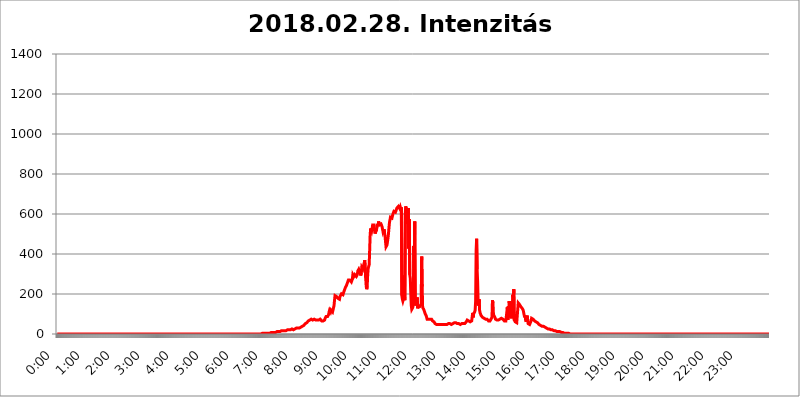
| Category | 2018.02.28. Intenzitás [W/m^2] |
|---|---|
| 0.0 | 0 |
| 0.0006944444444444445 | 0 |
| 0.001388888888888889 | 0 |
| 0.0020833333333333333 | 0 |
| 0.002777777777777778 | 0 |
| 0.003472222222222222 | 0 |
| 0.004166666666666667 | 0 |
| 0.004861111111111111 | 0 |
| 0.005555555555555556 | 0 |
| 0.0062499999999999995 | 0 |
| 0.006944444444444444 | 0 |
| 0.007638888888888889 | 0 |
| 0.008333333333333333 | 0 |
| 0.009027777777777779 | 0 |
| 0.009722222222222222 | 0 |
| 0.010416666666666666 | 0 |
| 0.011111111111111112 | 0 |
| 0.011805555555555555 | 0 |
| 0.012499999999999999 | 0 |
| 0.013194444444444444 | 0 |
| 0.013888888888888888 | 0 |
| 0.014583333333333332 | 0 |
| 0.015277777777777777 | 0 |
| 0.015972222222222224 | 0 |
| 0.016666666666666666 | 0 |
| 0.017361111111111112 | 0 |
| 0.018055555555555557 | 0 |
| 0.01875 | 0 |
| 0.019444444444444445 | 0 |
| 0.02013888888888889 | 0 |
| 0.020833333333333332 | 0 |
| 0.02152777777777778 | 0 |
| 0.022222222222222223 | 0 |
| 0.02291666666666667 | 0 |
| 0.02361111111111111 | 0 |
| 0.024305555555555556 | 0 |
| 0.024999999999999998 | 0 |
| 0.025694444444444447 | 0 |
| 0.02638888888888889 | 0 |
| 0.027083333333333334 | 0 |
| 0.027777777777777776 | 0 |
| 0.02847222222222222 | 0 |
| 0.029166666666666664 | 0 |
| 0.029861111111111113 | 0 |
| 0.030555555555555555 | 0 |
| 0.03125 | 0 |
| 0.03194444444444445 | 0 |
| 0.03263888888888889 | 0 |
| 0.03333333333333333 | 0 |
| 0.034027777777777775 | 0 |
| 0.034722222222222224 | 0 |
| 0.035416666666666666 | 0 |
| 0.036111111111111115 | 0 |
| 0.03680555555555556 | 0 |
| 0.0375 | 0 |
| 0.03819444444444444 | 0 |
| 0.03888888888888889 | 0 |
| 0.03958333333333333 | 0 |
| 0.04027777777777778 | 0 |
| 0.04097222222222222 | 0 |
| 0.041666666666666664 | 0 |
| 0.042361111111111106 | 0 |
| 0.04305555555555556 | 0 |
| 0.043750000000000004 | 0 |
| 0.044444444444444446 | 0 |
| 0.04513888888888889 | 0 |
| 0.04583333333333334 | 0 |
| 0.04652777777777778 | 0 |
| 0.04722222222222222 | 0 |
| 0.04791666666666666 | 0 |
| 0.04861111111111111 | 0 |
| 0.049305555555555554 | 0 |
| 0.049999999999999996 | 0 |
| 0.05069444444444445 | 0 |
| 0.051388888888888894 | 0 |
| 0.052083333333333336 | 0 |
| 0.05277777777777778 | 0 |
| 0.05347222222222222 | 0 |
| 0.05416666666666667 | 0 |
| 0.05486111111111111 | 0 |
| 0.05555555555555555 | 0 |
| 0.05625 | 0 |
| 0.05694444444444444 | 0 |
| 0.057638888888888885 | 0 |
| 0.05833333333333333 | 0 |
| 0.05902777777777778 | 0 |
| 0.059722222222222225 | 0 |
| 0.06041666666666667 | 0 |
| 0.061111111111111116 | 0 |
| 0.06180555555555556 | 0 |
| 0.0625 | 0 |
| 0.06319444444444444 | 0 |
| 0.06388888888888888 | 0 |
| 0.06458333333333334 | 0 |
| 0.06527777777777778 | 0 |
| 0.06597222222222222 | 0 |
| 0.06666666666666667 | 0 |
| 0.06736111111111111 | 0 |
| 0.06805555555555555 | 0 |
| 0.06874999999999999 | 0 |
| 0.06944444444444443 | 0 |
| 0.07013888888888889 | 0 |
| 0.07083333333333333 | 0 |
| 0.07152777777777779 | 0 |
| 0.07222222222222223 | 0 |
| 0.07291666666666667 | 0 |
| 0.07361111111111111 | 0 |
| 0.07430555555555556 | 0 |
| 0.075 | 0 |
| 0.07569444444444444 | 0 |
| 0.0763888888888889 | 0 |
| 0.07708333333333334 | 0 |
| 0.07777777777777778 | 0 |
| 0.07847222222222222 | 0 |
| 0.07916666666666666 | 0 |
| 0.0798611111111111 | 0 |
| 0.08055555555555556 | 0 |
| 0.08125 | 0 |
| 0.08194444444444444 | 0 |
| 0.08263888888888889 | 0 |
| 0.08333333333333333 | 0 |
| 0.08402777777777777 | 0 |
| 0.08472222222222221 | 0 |
| 0.08541666666666665 | 0 |
| 0.08611111111111112 | 0 |
| 0.08680555555555557 | 0 |
| 0.08750000000000001 | 0 |
| 0.08819444444444445 | 0 |
| 0.08888888888888889 | 0 |
| 0.08958333333333333 | 0 |
| 0.09027777777777778 | 0 |
| 0.09097222222222222 | 0 |
| 0.09166666666666667 | 0 |
| 0.09236111111111112 | 0 |
| 0.09305555555555556 | 0 |
| 0.09375 | 0 |
| 0.09444444444444444 | 0 |
| 0.09513888888888888 | 0 |
| 0.09583333333333333 | 0 |
| 0.09652777777777777 | 0 |
| 0.09722222222222222 | 0 |
| 0.09791666666666667 | 0 |
| 0.09861111111111111 | 0 |
| 0.09930555555555555 | 0 |
| 0.09999999999999999 | 0 |
| 0.10069444444444443 | 0 |
| 0.1013888888888889 | 0 |
| 0.10208333333333335 | 0 |
| 0.10277777777777779 | 0 |
| 0.10347222222222223 | 0 |
| 0.10416666666666667 | 0 |
| 0.10486111111111111 | 0 |
| 0.10555555555555556 | 0 |
| 0.10625 | 0 |
| 0.10694444444444444 | 0 |
| 0.1076388888888889 | 0 |
| 0.10833333333333334 | 0 |
| 0.10902777777777778 | 0 |
| 0.10972222222222222 | 0 |
| 0.1111111111111111 | 0 |
| 0.11180555555555556 | 0 |
| 0.11180555555555556 | 0 |
| 0.1125 | 0 |
| 0.11319444444444444 | 0 |
| 0.11388888888888889 | 0 |
| 0.11458333333333333 | 0 |
| 0.11527777777777777 | 0 |
| 0.11597222222222221 | 0 |
| 0.11666666666666665 | 0 |
| 0.1173611111111111 | 0 |
| 0.11805555555555557 | 0 |
| 0.11944444444444445 | 0 |
| 0.12013888888888889 | 0 |
| 0.12083333333333333 | 0 |
| 0.12152777777777778 | 0 |
| 0.12222222222222223 | 0 |
| 0.12291666666666667 | 0 |
| 0.12291666666666667 | 0 |
| 0.12361111111111112 | 0 |
| 0.12430555555555556 | 0 |
| 0.125 | 0 |
| 0.12569444444444444 | 0 |
| 0.12638888888888888 | 0 |
| 0.12708333333333333 | 0 |
| 0.16875 | 0 |
| 0.12847222222222224 | 0 |
| 0.12916666666666668 | 0 |
| 0.12986111111111112 | 0 |
| 0.13055555555555556 | 0 |
| 0.13125 | 0 |
| 0.13194444444444445 | 0 |
| 0.1326388888888889 | 0 |
| 0.13333333333333333 | 0 |
| 0.13402777777777777 | 0 |
| 0.13402777777777777 | 0 |
| 0.13472222222222222 | 0 |
| 0.13541666666666666 | 0 |
| 0.1361111111111111 | 0 |
| 0.13749999999999998 | 0 |
| 0.13819444444444443 | 0 |
| 0.1388888888888889 | 0 |
| 0.13958333333333334 | 0 |
| 0.14027777777777778 | 0 |
| 0.14097222222222222 | 0 |
| 0.14166666666666666 | 0 |
| 0.1423611111111111 | 0 |
| 0.14305555555555557 | 0 |
| 0.14375000000000002 | 0 |
| 0.14444444444444446 | 0 |
| 0.1451388888888889 | 0 |
| 0.1451388888888889 | 0 |
| 0.14652777777777778 | 0 |
| 0.14722222222222223 | 0 |
| 0.14791666666666667 | 0 |
| 0.1486111111111111 | 0 |
| 0.14930555555555555 | 0 |
| 0.15 | 0 |
| 0.15069444444444444 | 0 |
| 0.15138888888888888 | 0 |
| 0.15208333333333332 | 0 |
| 0.15277777777777776 | 0 |
| 0.15347222222222223 | 0 |
| 0.15416666666666667 | 0 |
| 0.15486111111111112 | 0 |
| 0.15555555555555556 | 0 |
| 0.15625 | 0 |
| 0.15694444444444444 | 0 |
| 0.15763888888888888 | 0 |
| 0.15833333333333333 | 0 |
| 0.15902777777777777 | 0 |
| 0.15972222222222224 | 0 |
| 0.16041666666666668 | 0 |
| 0.16111111111111112 | 0 |
| 0.16180555555555556 | 0 |
| 0.1625 | 0 |
| 0.16319444444444445 | 0 |
| 0.1638888888888889 | 0 |
| 0.16458333333333333 | 0 |
| 0.16527777777777777 | 0 |
| 0.16597222222222222 | 0 |
| 0.16666666666666666 | 0 |
| 0.1673611111111111 | 0 |
| 0.16805555555555554 | 0 |
| 0.16874999999999998 | 0 |
| 0.16944444444444443 | 0 |
| 0.17013888888888887 | 0 |
| 0.1708333333333333 | 0 |
| 0.17152777777777775 | 0 |
| 0.17222222222222225 | 0 |
| 0.1729166666666667 | 0 |
| 0.17361111111111113 | 0 |
| 0.17430555555555557 | 0 |
| 0.17500000000000002 | 0 |
| 0.17569444444444446 | 0 |
| 0.1763888888888889 | 0 |
| 0.17708333333333334 | 0 |
| 0.17777777777777778 | 0 |
| 0.17847222222222223 | 0 |
| 0.17916666666666667 | 0 |
| 0.1798611111111111 | 0 |
| 0.18055555555555555 | 0 |
| 0.18125 | 0 |
| 0.18194444444444444 | 0 |
| 0.1826388888888889 | 0 |
| 0.18333333333333335 | 0 |
| 0.1840277777777778 | 0 |
| 0.18472222222222223 | 0 |
| 0.18541666666666667 | 0 |
| 0.18611111111111112 | 0 |
| 0.18680555555555556 | 0 |
| 0.1875 | 0 |
| 0.18819444444444444 | 0 |
| 0.18888888888888888 | 0 |
| 0.18958333333333333 | 0 |
| 0.19027777777777777 | 0 |
| 0.1909722222222222 | 0 |
| 0.19166666666666665 | 0 |
| 0.19236111111111112 | 0 |
| 0.19305555555555554 | 0 |
| 0.19375 | 0 |
| 0.19444444444444445 | 0 |
| 0.1951388888888889 | 0 |
| 0.19583333333333333 | 0 |
| 0.19652777777777777 | 0 |
| 0.19722222222222222 | 0 |
| 0.19791666666666666 | 0 |
| 0.1986111111111111 | 0 |
| 0.19930555555555554 | 0 |
| 0.19999999999999998 | 0 |
| 0.20069444444444443 | 0 |
| 0.20138888888888887 | 0 |
| 0.2020833333333333 | 0 |
| 0.2027777777777778 | 0 |
| 0.2034722222222222 | 0 |
| 0.2041666666666667 | 0 |
| 0.20486111111111113 | 0 |
| 0.20555555555555557 | 0 |
| 0.20625000000000002 | 0 |
| 0.20694444444444446 | 0 |
| 0.2076388888888889 | 0 |
| 0.20833333333333334 | 0 |
| 0.20902777777777778 | 0 |
| 0.20972222222222223 | 0 |
| 0.21041666666666667 | 0 |
| 0.2111111111111111 | 0 |
| 0.21180555555555555 | 0 |
| 0.2125 | 0 |
| 0.21319444444444444 | 0 |
| 0.2138888888888889 | 0 |
| 0.21458333333333335 | 0 |
| 0.2152777777777778 | 0 |
| 0.21597222222222223 | 0 |
| 0.21666666666666667 | 0 |
| 0.21736111111111112 | 0 |
| 0.21805555555555556 | 0 |
| 0.21875 | 0 |
| 0.21944444444444444 | 0 |
| 0.22013888888888888 | 0 |
| 0.22083333333333333 | 0 |
| 0.22152777777777777 | 0 |
| 0.2222222222222222 | 0 |
| 0.22291666666666665 | 0 |
| 0.2236111111111111 | 0 |
| 0.22430555555555556 | 0 |
| 0.225 | 0 |
| 0.22569444444444445 | 0 |
| 0.2263888888888889 | 0 |
| 0.22708333333333333 | 0 |
| 0.22777777777777777 | 0 |
| 0.22847222222222222 | 0 |
| 0.22916666666666666 | 0 |
| 0.2298611111111111 | 0 |
| 0.23055555555555554 | 0 |
| 0.23124999999999998 | 0 |
| 0.23194444444444443 | 0 |
| 0.23263888888888887 | 0 |
| 0.2333333333333333 | 0 |
| 0.2340277777777778 | 0 |
| 0.2347222222222222 | 0 |
| 0.2354166666666667 | 0 |
| 0.23611111111111113 | 0 |
| 0.23680555555555557 | 0 |
| 0.23750000000000002 | 0 |
| 0.23819444444444446 | 0 |
| 0.2388888888888889 | 0 |
| 0.23958333333333334 | 0 |
| 0.24027777777777778 | 0 |
| 0.24097222222222223 | 0 |
| 0.24166666666666667 | 0 |
| 0.2423611111111111 | 0 |
| 0.24305555555555555 | 0 |
| 0.24375 | 0 |
| 0.24444444444444446 | 0 |
| 0.24513888888888888 | 0 |
| 0.24583333333333335 | 0 |
| 0.2465277777777778 | 0 |
| 0.24722222222222223 | 0 |
| 0.24791666666666667 | 0 |
| 0.24861111111111112 | 0 |
| 0.24930555555555556 | 0 |
| 0.25 | 0 |
| 0.25069444444444444 | 0 |
| 0.2513888888888889 | 0 |
| 0.2520833333333333 | 0 |
| 0.25277777777777777 | 0 |
| 0.2534722222222222 | 0 |
| 0.25416666666666665 | 0 |
| 0.2548611111111111 | 0 |
| 0.2555555555555556 | 0 |
| 0.25625000000000003 | 0 |
| 0.2569444444444445 | 0 |
| 0.2576388888888889 | 0 |
| 0.25833333333333336 | 0 |
| 0.2590277777777778 | 0 |
| 0.25972222222222224 | 0 |
| 0.2604166666666667 | 0 |
| 0.2611111111111111 | 0 |
| 0.26180555555555557 | 0 |
| 0.2625 | 0 |
| 0.26319444444444445 | 0 |
| 0.2638888888888889 | 0 |
| 0.26458333333333334 | 0 |
| 0.2652777777777778 | 0 |
| 0.2659722222222222 | 0 |
| 0.26666666666666666 | 0 |
| 0.2673611111111111 | 0 |
| 0.26805555555555555 | 0 |
| 0.26875 | 0 |
| 0.26944444444444443 | 0 |
| 0.2701388888888889 | 0 |
| 0.2708333333333333 | 0 |
| 0.27152777777777776 | 0 |
| 0.2722222222222222 | 0 |
| 0.27291666666666664 | 0 |
| 0.2736111111111111 | 0 |
| 0.2743055555555555 | 0 |
| 0.27499999999999997 | 0 |
| 0.27569444444444446 | 0 |
| 0.27638888888888885 | 0 |
| 0.27708333333333335 | 0 |
| 0.2777777777777778 | 0 |
| 0.27847222222222223 | 0 |
| 0.2791666666666667 | 0 |
| 0.2798611111111111 | 0 |
| 0.28055555555555556 | 0 |
| 0.28125 | 0 |
| 0.28194444444444444 | 0 |
| 0.2826388888888889 | 0 |
| 0.2833333333333333 | 0 |
| 0.28402777777777777 | 0 |
| 0.2847222222222222 | 0 |
| 0.28541666666666665 | 0 |
| 0.28611111111111115 | 3.525 |
| 0.28680555555555554 | 0 |
| 0.28750000000000003 | 3.525 |
| 0.2881944444444445 | 3.525 |
| 0.2888888888888889 | 3.525 |
| 0.28958333333333336 | 3.525 |
| 0.2902777777777778 | 3.525 |
| 0.29097222222222224 | 3.525 |
| 0.2916666666666667 | 3.525 |
| 0.2923611111111111 | 3.525 |
| 0.29305555555555557 | 3.525 |
| 0.29375 | 3.525 |
| 0.29444444444444445 | 3.525 |
| 0.2951388888888889 | 3.525 |
| 0.29583333333333334 | 3.525 |
| 0.2965277777777778 | 3.525 |
| 0.2972222222222222 | 3.525 |
| 0.29791666666666666 | 3.525 |
| 0.2986111111111111 | 7.887 |
| 0.29930555555555555 | 7.887 |
| 0.3 | 7.887 |
| 0.30069444444444443 | 7.887 |
| 0.3013888888888889 | 7.887 |
| 0.3020833333333333 | 7.887 |
| 0.30277777777777776 | 7.887 |
| 0.3034722222222222 | 7.887 |
| 0.30416666666666664 | 7.887 |
| 0.3048611111111111 | 7.887 |
| 0.3055555555555555 | 7.887 |
| 0.30624999999999997 | 7.887 |
| 0.3069444444444444 | 7.887 |
| 0.3076388888888889 | 12.257 |
| 0.30833333333333335 | 12.257 |
| 0.3090277777777778 | 12.257 |
| 0.30972222222222223 | 12.257 |
| 0.3104166666666667 | 12.257 |
| 0.3111111111111111 | 12.257 |
| 0.31180555555555556 | 12.257 |
| 0.3125 | 12.257 |
| 0.31319444444444444 | 12.257 |
| 0.3138888888888889 | 12.257 |
| 0.3145833333333333 | 16.636 |
| 0.31527777777777777 | 16.636 |
| 0.3159722222222222 | 16.636 |
| 0.31666666666666665 | 16.636 |
| 0.31736111111111115 | 16.636 |
| 0.31805555555555554 | 16.636 |
| 0.31875000000000003 | 16.636 |
| 0.3194444444444445 | 16.636 |
| 0.3201388888888889 | 16.636 |
| 0.32083333333333336 | 16.636 |
| 0.3215277777777778 | 16.636 |
| 0.32222222222222224 | 16.636 |
| 0.3229166666666667 | 21.024 |
| 0.3236111111111111 | 21.024 |
| 0.32430555555555557 | 21.024 |
| 0.325 | 21.024 |
| 0.32569444444444445 | 21.024 |
| 0.3263888888888889 | 21.024 |
| 0.32708333333333334 | 21.024 |
| 0.3277777777777778 | 25.419 |
| 0.3284722222222222 | 25.419 |
| 0.32916666666666666 | 25.419 |
| 0.3298611111111111 | 25.419 |
| 0.33055555555555555 | 25.419 |
| 0.33125 | 21.024 |
| 0.33194444444444443 | 21.024 |
| 0.3326388888888889 | 25.419 |
| 0.3333333333333333 | 25.419 |
| 0.3340277777777778 | 25.419 |
| 0.3347222222222222 | 25.419 |
| 0.3354166666666667 | 29.823 |
| 0.3361111111111111 | 29.823 |
| 0.3368055555555556 | 29.823 |
| 0.33749999999999997 | 29.823 |
| 0.33819444444444446 | 29.823 |
| 0.33888888888888885 | 29.823 |
| 0.33958333333333335 | 29.823 |
| 0.34027777777777773 | 29.823 |
| 0.34097222222222223 | 34.234 |
| 0.3416666666666666 | 34.234 |
| 0.3423611111111111 | 34.234 |
| 0.3430555555555555 | 34.234 |
| 0.34375 | 38.653 |
| 0.3444444444444445 | 38.653 |
| 0.3451388888888889 | 38.653 |
| 0.3458333333333334 | 43.079 |
| 0.34652777777777777 | 47.511 |
| 0.34722222222222227 | 47.511 |
| 0.34791666666666665 | 51.951 |
| 0.34861111111111115 | 56.398 |
| 0.34930555555555554 | 56.398 |
| 0.35000000000000003 | 56.398 |
| 0.3506944444444444 | 60.85 |
| 0.3513888888888889 | 60.85 |
| 0.3520833333333333 | 65.31 |
| 0.3527777777777778 | 65.31 |
| 0.3534722222222222 | 65.31 |
| 0.3541666666666667 | 69.775 |
| 0.3548611111111111 | 69.775 |
| 0.35555555555555557 | 69.775 |
| 0.35625 | 74.246 |
| 0.35694444444444445 | 74.246 |
| 0.3576388888888889 | 69.775 |
| 0.35833333333333334 | 69.775 |
| 0.3590277777777778 | 74.246 |
| 0.3597222222222222 | 74.246 |
| 0.36041666666666666 | 74.246 |
| 0.3611111111111111 | 69.775 |
| 0.36180555555555555 | 74.246 |
| 0.3625 | 69.775 |
| 0.36319444444444443 | 69.775 |
| 0.3638888888888889 | 69.775 |
| 0.3645833333333333 | 69.775 |
| 0.3652777777777778 | 69.775 |
| 0.3659722222222222 | 69.775 |
| 0.3666666666666667 | 69.775 |
| 0.3673611111111111 | 74.246 |
| 0.3680555555555556 | 74.246 |
| 0.36874999999999997 | 74.246 |
| 0.36944444444444446 | 74.246 |
| 0.37013888888888885 | 69.775 |
| 0.37083333333333335 | 65.31 |
| 0.37152777777777773 | 65.31 |
| 0.37222222222222223 | 65.31 |
| 0.3729166666666666 | 65.31 |
| 0.3736111111111111 | 65.31 |
| 0.3743055555555555 | 65.31 |
| 0.375 | 69.775 |
| 0.3756944444444445 | 78.722 |
| 0.3763888888888889 | 83.205 |
| 0.3770833333333334 | 87.692 |
| 0.37777777777777777 | 83.205 |
| 0.37847222222222227 | 83.205 |
| 0.37916666666666665 | 87.692 |
| 0.37986111111111115 | 92.184 |
| 0.38055555555555554 | 96.682 |
| 0.38125000000000003 | 110.201 |
| 0.3819444444444444 | 119.235 |
| 0.3826388888888889 | 119.235 |
| 0.3833333333333333 | 110.201 |
| 0.3840277777777778 | 119.235 |
| 0.3847222222222222 | 123.758 |
| 0.3854166666666667 | 119.235 |
| 0.3861111111111111 | 110.201 |
| 0.38680555555555557 | 110.201 |
| 0.3875 | 105.69 |
| 0.38819444444444445 | 141.884 |
| 0.3888888888888889 | 169.156 |
| 0.38958333333333334 | 191.937 |
| 0.3902777777777778 | 191.937 |
| 0.3909722222222222 | 187.378 |
| 0.39166666666666666 | 187.378 |
| 0.3923611111111111 | 182.82 |
| 0.39305555555555555 | 182.82 |
| 0.39375 | 178.264 |
| 0.39444444444444443 | 173.709 |
| 0.3951388888888889 | 173.709 |
| 0.3958333333333333 | 173.709 |
| 0.3965277777777778 | 187.378 |
| 0.3972222222222222 | 182.82 |
| 0.3979166666666667 | 187.378 |
| 0.3986111111111111 | 201.058 |
| 0.3993055555555556 | 201.058 |
| 0.39999999999999997 | 201.058 |
| 0.40069444444444446 | 196.497 |
| 0.40138888888888885 | 196.497 |
| 0.40208333333333335 | 201.058 |
| 0.40277777777777773 | 219.309 |
| 0.40347222222222223 | 223.873 |
| 0.4041666666666666 | 233 |
| 0.4048611111111111 | 237.564 |
| 0.4055555555555555 | 242.127 |
| 0.40625 | 246.689 |
| 0.4069444444444445 | 255.813 |
| 0.4076388888888889 | 255.813 |
| 0.4083333333333334 | 269.49 |
| 0.40902777777777777 | 269.49 |
| 0.40972222222222227 | 269.49 |
| 0.41041666666666665 | 269.49 |
| 0.41111111111111115 | 274.047 |
| 0.41180555555555554 | 269.49 |
| 0.41250000000000003 | 260.373 |
| 0.4131944444444444 | 255.813 |
| 0.4138888888888889 | 274.047 |
| 0.4145833333333333 | 296.808 |
| 0.4152777777777778 | 292.259 |
| 0.4159722222222222 | 287.709 |
| 0.4166666666666667 | 292.259 |
| 0.4173611111111111 | 296.808 |
| 0.41805555555555557 | 301.354 |
| 0.41875 | 296.808 |
| 0.41944444444444445 | 287.709 |
| 0.4201388888888889 | 287.709 |
| 0.42083333333333334 | 296.808 |
| 0.4215277777777778 | 314.98 |
| 0.4222222222222222 | 314.98 |
| 0.42291666666666666 | 324.052 |
| 0.4236111111111111 | 324.052 |
| 0.42430555555555555 | 319.517 |
| 0.425 | 305.898 |
| 0.42569444444444443 | 292.259 |
| 0.4263888888888889 | 305.898 |
| 0.4270833333333333 | 333.113 |
| 0.4277777777777778 | 328.584 |
| 0.4284722222222222 | 324.052 |
| 0.4291666666666667 | 333.113 |
| 0.4298611111111111 | 346.682 |
| 0.4305555555555556 | 355.712 |
| 0.43124999999999997 | 369.23 |
| 0.43194444444444446 | 364.728 |
| 0.43263888888888885 | 278.603 |
| 0.43333333333333335 | 237.564 |
| 0.43402777777777773 | 223.873 |
| 0.43472222222222223 | 237.564 |
| 0.4354166666666666 | 296.808 |
| 0.4361111111111111 | 328.584 |
| 0.4368055555555555 | 337.639 |
| 0.4375 | 346.682 |
| 0.4381944444444445 | 346.682 |
| 0.4388888888888889 | 497.836 |
| 0.4395833333333334 | 528.2 |
| 0.44027777777777777 | 528.2 |
| 0.44097222222222227 | 515.223 |
| 0.44166666666666665 | 528.2 |
| 0.44236111111111115 | 545.416 |
| 0.44305555555555554 | 549.704 |
| 0.44375000000000003 | 549.704 |
| 0.4444444444444444 | 545.416 |
| 0.4451388888888889 | 515.223 |
| 0.4458333333333333 | 502.192 |
| 0.4465277777777778 | 497.836 |
| 0.4472222222222222 | 506.542 |
| 0.4479166666666667 | 523.88 |
| 0.4486111111111111 | 523.88 |
| 0.44930555555555557 | 549.704 |
| 0.45 | 541.121 |
| 0.45069444444444445 | 562.53 |
| 0.4513888888888889 | 566.793 |
| 0.45208333333333334 | 545.416 |
| 0.4527777777777778 | 545.416 |
| 0.4534722222222222 | 541.121 |
| 0.45416666666666666 | 549.704 |
| 0.4548611111111111 | 553.986 |
| 0.45555555555555555 | 536.82 |
| 0.45625 | 523.88 |
| 0.45694444444444443 | 510.885 |
| 0.4576388888888889 | 506.542 |
| 0.4583333333333333 | 523.88 |
| 0.4590277777777778 | 506.542 |
| 0.4597222222222222 | 489.108 |
| 0.4604166666666667 | 489.108 |
| 0.4611111111111111 | 436.27 |
| 0.4618055555555556 | 440.702 |
| 0.46249999999999997 | 445.129 |
| 0.46319444444444446 | 445.129 |
| 0.46388888888888885 | 480.356 |
| 0.46458333333333335 | 502.192 |
| 0.46527777777777773 | 532.513 |
| 0.46597222222222223 | 558.261 |
| 0.4666666666666666 | 571.049 |
| 0.4673611111111111 | 583.779 |
| 0.4680555555555555 | 588.009 |
| 0.46875 | 588.009 |
| 0.4694444444444445 | 579.542 |
| 0.4701388888888889 | 583.779 |
| 0.4708333333333334 | 600.661 |
| 0.47152777777777777 | 604.864 |
| 0.47222222222222227 | 613.252 |
| 0.47291666666666665 | 617.436 |
| 0.47361111111111115 | 609.062 |
| 0.47430555555555554 | 609.062 |
| 0.47500000000000003 | 609.062 |
| 0.4756944444444444 | 609.062 |
| 0.4763888888888889 | 629.948 |
| 0.4770833333333333 | 625.784 |
| 0.4777777777777778 | 634.105 |
| 0.4784722222222222 | 638.256 |
| 0.4791666666666667 | 638.256 |
| 0.4798611111111111 | 638.256 |
| 0.48055555555555557 | 625.784 |
| 0.48125 | 634.105 |
| 0.48194444444444445 | 625.784 |
| 0.4826388888888889 | 634.105 |
| 0.48333333333333334 | 191.937 |
| 0.4840277777777778 | 173.709 |
| 0.4847222222222222 | 164.605 |
| 0.48541666666666666 | 173.709 |
| 0.4861111111111111 | 292.259 |
| 0.48680555555555555 | 205.62 |
| 0.4875 | 169.156 |
| 0.48819444444444443 | 604.864 |
| 0.4888888888888889 | 638.256 |
| 0.4895833333333333 | 609.062 |
| 0.4902777777777778 | 549.704 |
| 0.4909722222222222 | 588.009 |
| 0.4916666666666667 | 600.661 |
| 0.4923611111111111 | 629.948 |
| 0.4930555555555556 | 427.39 |
| 0.49374999999999997 | 575.299 |
| 0.49444444444444446 | 296.808 |
| 0.49513888888888885 | 278.603 |
| 0.49583333333333335 | 205.62 |
| 0.49652777777777773 | 141.884 |
| 0.49722222222222223 | 123.758 |
| 0.4979166666666666 | 123.758 |
| 0.4986111111111111 | 132.814 |
| 0.4993055555555555 | 146.423 |
| 0.5 | 440.702 |
| 0.5006944444444444 | 328.584 |
| 0.5013888888888889 | 562.53 |
| 0.5020833333333333 | 173.709 |
| 0.5027777777777778 | 141.884 |
| 0.5034722222222222 | 137.347 |
| 0.5041666666666667 | 146.423 |
| 0.5048611111111111 | 182.82 |
| 0.5055555555555555 | 128.284 |
| 0.50625 | 137.347 |
| 0.5069444444444444 | 141.884 |
| 0.5076388888888889 | 141.884 |
| 0.5083333333333333 | 137.347 |
| 0.5090277777777777 | 137.347 |
| 0.5097222222222222 | 141.884 |
| 0.5104166666666666 | 150.964 |
| 0.5111111111111112 | 387.202 |
| 0.5118055555555555 | 237.564 |
| 0.5125000000000001 | 132.814 |
| 0.5131944444444444 | 128.284 |
| 0.513888888888889 | 123.758 |
| 0.5145833333333333 | 119.235 |
| 0.5152777777777778 | 110.201 |
| 0.5159722222222222 | 101.184 |
| 0.5166666666666667 | 96.682 |
| 0.517361111111111 | 92.184 |
| 0.5180555555555556 | 83.205 |
| 0.5187499999999999 | 74.246 |
| 0.5194444444444445 | 69.775 |
| 0.5201388888888888 | 69.775 |
| 0.5208333333333334 | 74.246 |
| 0.5215277777777778 | 74.246 |
| 0.5222222222222223 | 74.246 |
| 0.5229166666666667 | 74.246 |
| 0.5236111111111111 | 74.246 |
| 0.5243055555555556 | 74.246 |
| 0.525 | 74.246 |
| 0.5256944444444445 | 69.775 |
| 0.5263888888888889 | 65.31 |
| 0.5270833333333333 | 65.31 |
| 0.5277777777777778 | 60.85 |
| 0.5284722222222222 | 60.85 |
| 0.5291666666666667 | 56.398 |
| 0.5298611111111111 | 51.951 |
| 0.5305555555555556 | 51.951 |
| 0.53125 | 51.951 |
| 0.5319444444444444 | 47.511 |
| 0.5326388888888889 | 47.511 |
| 0.5333333333333333 | 47.511 |
| 0.5340277777777778 | 47.511 |
| 0.5347222222222222 | 47.511 |
| 0.5354166666666667 | 47.511 |
| 0.5361111111111111 | 47.511 |
| 0.5368055555555555 | 47.511 |
| 0.5375 | 47.511 |
| 0.5381944444444444 | 47.511 |
| 0.5388888888888889 | 47.511 |
| 0.5395833333333333 | 47.511 |
| 0.5402777777777777 | 47.511 |
| 0.5409722222222222 | 47.511 |
| 0.5416666666666666 | 47.511 |
| 0.5423611111111112 | 47.511 |
| 0.5430555555555555 | 47.511 |
| 0.5437500000000001 | 47.511 |
| 0.5444444444444444 | 47.511 |
| 0.545138888888889 | 47.511 |
| 0.5458333333333333 | 47.511 |
| 0.5465277777777778 | 47.511 |
| 0.5472222222222222 | 47.511 |
| 0.5479166666666667 | 51.951 |
| 0.548611111111111 | 51.951 |
| 0.5493055555555556 | 51.951 |
| 0.5499999999999999 | 51.951 |
| 0.5506944444444445 | 51.951 |
| 0.5513888888888888 | 51.951 |
| 0.5520833333333334 | 51.951 |
| 0.5527777777777778 | 47.511 |
| 0.5534722222222223 | 47.511 |
| 0.5541666666666667 | 47.511 |
| 0.5548611111111111 | 51.951 |
| 0.5555555555555556 | 51.951 |
| 0.55625 | 51.951 |
| 0.5569444444444445 | 56.398 |
| 0.5576388888888889 | 56.398 |
| 0.5583333333333333 | 56.398 |
| 0.5590277777777778 | 56.398 |
| 0.5597222222222222 | 51.951 |
| 0.5604166666666667 | 51.951 |
| 0.5611111111111111 | 51.951 |
| 0.5618055555555556 | 51.951 |
| 0.5625 | 51.951 |
| 0.5631944444444444 | 51.951 |
| 0.5638888888888889 | 47.511 |
| 0.5645833333333333 | 47.511 |
| 0.5652777777777778 | 47.511 |
| 0.5659722222222222 | 47.511 |
| 0.5666666666666667 | 51.951 |
| 0.5673611111111111 | 51.951 |
| 0.5680555555555555 | 51.951 |
| 0.56875 | 51.951 |
| 0.5694444444444444 | 51.951 |
| 0.5701388888888889 | 51.951 |
| 0.5708333333333333 | 51.951 |
| 0.5715277777777777 | 51.951 |
| 0.5722222222222222 | 56.398 |
| 0.5729166666666666 | 56.398 |
| 0.5736111111111112 | 60.85 |
| 0.5743055555555555 | 65.31 |
| 0.5750000000000001 | 69.775 |
| 0.5756944444444444 | 69.775 |
| 0.576388888888889 | 69.775 |
| 0.5770833333333333 | 65.31 |
| 0.5777777777777778 | 65.31 |
| 0.5784722222222222 | 60.85 |
| 0.5791666666666667 | 60.85 |
| 0.579861111111111 | 60.85 |
| 0.5805555555555556 | 60.85 |
| 0.5812499999999999 | 65.31 |
| 0.5819444444444445 | 65.31 |
| 0.5826388888888888 | 105.69 |
| 0.5833333333333334 | 83.205 |
| 0.5840277777777778 | 101.184 |
| 0.5847222222222223 | 101.184 |
| 0.5854166666666667 | 110.201 |
| 0.5861111111111111 | 119.235 |
| 0.5868055555555556 | 164.605 |
| 0.5875 | 418.492 |
| 0.5881944444444445 | 475.972 |
| 0.5888888888888889 | 324.052 |
| 0.5895833333333333 | 264.932 |
| 0.5902777777777778 | 164.605 |
| 0.5909722222222222 | 141.884 |
| 0.5916666666666667 | 173.709 |
| 0.5923611111111111 | 119.235 |
| 0.5930555555555556 | 105.69 |
| 0.59375 | 101.184 |
| 0.5944444444444444 | 92.184 |
| 0.5951388888888889 | 92.184 |
| 0.5958333333333333 | 87.692 |
| 0.5965277777777778 | 83.205 |
| 0.5972222222222222 | 83.205 |
| 0.5979166666666667 | 83.205 |
| 0.5986111111111111 | 78.722 |
| 0.5993055555555555 | 78.722 |
| 0.6 | 74.246 |
| 0.6006944444444444 | 74.246 |
| 0.6013888888888889 | 78.722 |
| 0.6020833333333333 | 78.722 |
| 0.6027777777777777 | 74.246 |
| 0.6034722222222222 | 74.246 |
| 0.6041666666666666 | 69.775 |
| 0.6048611111111112 | 65.31 |
| 0.6055555555555555 | 65.31 |
| 0.6062500000000001 | 65.31 |
| 0.6069444444444444 | 65.31 |
| 0.607638888888889 | 69.775 |
| 0.6083333333333333 | 74.246 |
| 0.6090277777777778 | 74.246 |
| 0.6097222222222222 | 83.205 |
| 0.6104166666666667 | 169.156 |
| 0.611111111111111 | 155.509 |
| 0.6118055555555556 | 96.682 |
| 0.6124999999999999 | 92.184 |
| 0.6131944444444445 | 92.184 |
| 0.6138888888888888 | 83.205 |
| 0.6145833333333334 | 74.246 |
| 0.6152777777777778 | 69.775 |
| 0.6159722222222223 | 69.775 |
| 0.6166666666666667 | 69.775 |
| 0.6173611111111111 | 74.246 |
| 0.6180555555555556 | 69.775 |
| 0.61875 | 69.775 |
| 0.6194444444444445 | 69.775 |
| 0.6201388888888889 | 74.246 |
| 0.6208333333333333 | 74.246 |
| 0.6215277777777778 | 74.246 |
| 0.6222222222222222 | 78.722 |
| 0.6229166666666667 | 78.722 |
| 0.6236111111111111 | 78.722 |
| 0.6243055555555556 | 74.246 |
| 0.625 | 74.246 |
| 0.6256944444444444 | 74.246 |
| 0.6263888888888889 | 69.775 |
| 0.6270833333333333 | 65.31 |
| 0.6277777777777778 | 65.31 |
| 0.6284722222222222 | 65.31 |
| 0.6291666666666667 | 65.31 |
| 0.6298611111111111 | 65.31 |
| 0.6305555555555555 | 65.31 |
| 0.63125 | 132.814 |
| 0.6319444444444444 | 69.775 |
| 0.6326388888888889 | 137.347 |
| 0.6333333333333333 | 92.184 |
| 0.6340277777777777 | 164.605 |
| 0.6347222222222222 | 96.682 |
| 0.6354166666666666 | 96.682 |
| 0.6361111111111112 | 83.205 |
| 0.6368055555555555 | 83.205 |
| 0.6375000000000001 | 83.205 |
| 0.6381944444444444 | 83.205 |
| 0.638888888888889 | 196.497 |
| 0.6395833333333333 | 146.423 |
| 0.6402777777777778 | 223.873 |
| 0.6409722222222222 | 69.775 |
| 0.6416666666666667 | 69.775 |
| 0.642361111111111 | 60.85 |
| 0.6430555555555556 | 56.398 |
| 0.6437499999999999 | 56.398 |
| 0.6444444444444445 | 56.398 |
| 0.6451388888888888 | 56.398 |
| 0.6458333333333334 | 56.398 |
| 0.6465277777777778 | 155.509 |
| 0.6472222222222223 | 160.056 |
| 0.6479166666666667 | 155.509 |
| 0.6486111111111111 | 146.423 |
| 0.6493055555555556 | 141.884 |
| 0.65 | 137.347 |
| 0.6506944444444445 | 132.814 |
| 0.6513888888888889 | 132.814 |
| 0.6520833333333333 | 128.284 |
| 0.6527777777777778 | 128.284 |
| 0.6534722222222222 | 119.235 |
| 0.6541666666666667 | 123.758 |
| 0.6548611111111111 | 114.716 |
| 0.6555555555555556 | 83.205 |
| 0.65625 | 92.184 |
| 0.6569444444444444 | 69.775 |
| 0.6576388888888889 | 60.85 |
| 0.6583333333333333 | 74.246 |
| 0.6590277777777778 | 92.184 |
| 0.6597222222222222 | 74.246 |
| 0.6604166666666667 | 51.951 |
| 0.6611111111111111 | 47.511 |
| 0.6618055555555555 | 47.511 |
| 0.6625 | 47.511 |
| 0.6631944444444444 | 47.511 |
| 0.6638888888888889 | 47.511 |
| 0.6645833333333333 | 65.31 |
| 0.6652777777777777 | 78.722 |
| 0.6659722222222222 | 78.722 |
| 0.6666666666666666 | 74.246 |
| 0.6673611111111111 | 74.246 |
| 0.6680555555555556 | 69.775 |
| 0.6687500000000001 | 69.775 |
| 0.6694444444444444 | 65.31 |
| 0.6701388888888888 | 65.31 |
| 0.6708333333333334 | 60.85 |
| 0.6715277777777778 | 60.85 |
| 0.6722222222222222 | 56.398 |
| 0.6729166666666666 | 56.398 |
| 0.6736111111111112 | 56.398 |
| 0.6743055555555556 | 51.951 |
| 0.6749999999999999 | 51.951 |
| 0.6756944444444444 | 47.511 |
| 0.6763888888888889 | 47.511 |
| 0.6770833333333334 | 47.511 |
| 0.6777777777777777 | 43.079 |
| 0.6784722222222223 | 43.079 |
| 0.6791666666666667 | 43.079 |
| 0.6798611111111111 | 38.653 |
| 0.6805555555555555 | 38.653 |
| 0.68125 | 38.653 |
| 0.6819444444444445 | 38.653 |
| 0.6826388888888889 | 34.234 |
| 0.6833333333333332 | 34.234 |
| 0.6840277777777778 | 34.234 |
| 0.6847222222222222 | 34.234 |
| 0.6854166666666667 | 29.823 |
| 0.686111111111111 | 29.823 |
| 0.6868055555555556 | 29.823 |
| 0.6875 | 29.823 |
| 0.6881944444444444 | 25.419 |
| 0.688888888888889 | 25.419 |
| 0.6895833333333333 | 25.419 |
| 0.6902777777777778 | 25.419 |
| 0.6909722222222222 | 25.419 |
| 0.6916666666666668 | 21.024 |
| 0.6923611111111111 | 21.024 |
| 0.6930555555555555 | 21.024 |
| 0.69375 | 21.024 |
| 0.6944444444444445 | 21.024 |
| 0.6951388888888889 | 21.024 |
| 0.6958333333333333 | 16.636 |
| 0.6965277777777777 | 16.636 |
| 0.6972222222222223 | 16.636 |
| 0.6979166666666666 | 16.636 |
| 0.6986111111111111 | 16.636 |
| 0.6993055555555556 | 12.257 |
| 0.7000000000000001 | 12.257 |
| 0.7006944444444444 | 12.257 |
| 0.7013888888888888 | 12.257 |
| 0.7020833333333334 | 12.257 |
| 0.7027777777777778 | 12.257 |
| 0.7034722222222222 | 12.257 |
| 0.7041666666666666 | 12.257 |
| 0.7048611111111112 | 12.257 |
| 0.7055555555555556 | 7.887 |
| 0.7062499999999999 | 7.887 |
| 0.7069444444444444 | 7.887 |
| 0.7076388888888889 | 7.887 |
| 0.7083333333333334 | 7.887 |
| 0.7090277777777777 | 7.887 |
| 0.7097222222222223 | 7.887 |
| 0.7104166666666667 | 7.887 |
| 0.7111111111111111 | 3.525 |
| 0.7118055555555555 | 7.887 |
| 0.7125 | 3.525 |
| 0.7131944444444445 | 3.525 |
| 0.7138888888888889 | 3.525 |
| 0.7145833333333332 | 3.525 |
| 0.7152777777777778 | 3.525 |
| 0.7159722222222222 | 3.525 |
| 0.7166666666666667 | 3.525 |
| 0.717361111111111 | 3.525 |
| 0.7180555555555556 | 3.525 |
| 0.71875 | 0 |
| 0.7194444444444444 | 0 |
| 0.720138888888889 | 0 |
| 0.7208333333333333 | 0 |
| 0.7215277777777778 | 0 |
| 0.7222222222222222 | 0 |
| 0.7229166666666668 | 0 |
| 0.7236111111111111 | 0 |
| 0.7243055555555555 | 0 |
| 0.725 | 0 |
| 0.7256944444444445 | 0 |
| 0.7263888888888889 | 0 |
| 0.7270833333333333 | 0 |
| 0.7277777777777777 | 0 |
| 0.7284722222222223 | 0 |
| 0.7291666666666666 | 0 |
| 0.7298611111111111 | 0 |
| 0.7305555555555556 | 0 |
| 0.7312500000000001 | 0 |
| 0.7319444444444444 | 0 |
| 0.7326388888888888 | 0 |
| 0.7333333333333334 | 0 |
| 0.7340277777777778 | 0 |
| 0.7347222222222222 | 0 |
| 0.7354166666666666 | 0 |
| 0.7361111111111112 | 0 |
| 0.7368055555555556 | 0 |
| 0.7374999999999999 | 0 |
| 0.7381944444444444 | 0 |
| 0.7388888888888889 | 0 |
| 0.7395833333333334 | 0 |
| 0.7402777777777777 | 0 |
| 0.7409722222222223 | 0 |
| 0.7416666666666667 | 0 |
| 0.7423611111111111 | 0 |
| 0.7430555555555555 | 0 |
| 0.74375 | 0 |
| 0.7444444444444445 | 0 |
| 0.7451388888888889 | 0 |
| 0.7458333333333332 | 0 |
| 0.7465277777777778 | 0 |
| 0.7472222222222222 | 0 |
| 0.7479166666666667 | 0 |
| 0.748611111111111 | 0 |
| 0.7493055555555556 | 0 |
| 0.75 | 0 |
| 0.7506944444444444 | 0 |
| 0.751388888888889 | 0 |
| 0.7520833333333333 | 0 |
| 0.7527777777777778 | 0 |
| 0.7534722222222222 | 0 |
| 0.7541666666666668 | 0 |
| 0.7548611111111111 | 0 |
| 0.7555555555555555 | 0 |
| 0.75625 | 0 |
| 0.7569444444444445 | 0 |
| 0.7576388888888889 | 0 |
| 0.7583333333333333 | 0 |
| 0.7590277777777777 | 0 |
| 0.7597222222222223 | 0 |
| 0.7604166666666666 | 0 |
| 0.7611111111111111 | 0 |
| 0.7618055555555556 | 0 |
| 0.7625000000000001 | 0 |
| 0.7631944444444444 | 0 |
| 0.7638888888888888 | 0 |
| 0.7645833333333334 | 0 |
| 0.7652777777777778 | 0 |
| 0.7659722222222222 | 0 |
| 0.7666666666666666 | 0 |
| 0.7673611111111112 | 0 |
| 0.7680555555555556 | 0 |
| 0.7687499999999999 | 0 |
| 0.7694444444444444 | 0 |
| 0.7701388888888889 | 0 |
| 0.7708333333333334 | 0 |
| 0.7715277777777777 | 0 |
| 0.7722222222222223 | 0 |
| 0.7729166666666667 | 0 |
| 0.7736111111111111 | 0 |
| 0.7743055555555555 | 0 |
| 0.775 | 0 |
| 0.7756944444444445 | 0 |
| 0.7763888888888889 | 0 |
| 0.7770833333333332 | 0 |
| 0.7777777777777778 | 0 |
| 0.7784722222222222 | 0 |
| 0.7791666666666667 | 0 |
| 0.779861111111111 | 0 |
| 0.7805555555555556 | 0 |
| 0.78125 | 0 |
| 0.7819444444444444 | 0 |
| 0.782638888888889 | 0 |
| 0.7833333333333333 | 0 |
| 0.7840277777777778 | 0 |
| 0.7847222222222222 | 0 |
| 0.7854166666666668 | 0 |
| 0.7861111111111111 | 0 |
| 0.7868055555555555 | 0 |
| 0.7875 | 0 |
| 0.7881944444444445 | 0 |
| 0.7888888888888889 | 0 |
| 0.7895833333333333 | 0 |
| 0.7902777777777777 | 0 |
| 0.7909722222222223 | 0 |
| 0.7916666666666666 | 0 |
| 0.7923611111111111 | 0 |
| 0.7930555555555556 | 0 |
| 0.7937500000000001 | 0 |
| 0.7944444444444444 | 0 |
| 0.7951388888888888 | 0 |
| 0.7958333333333334 | 0 |
| 0.7965277777777778 | 0 |
| 0.7972222222222222 | 0 |
| 0.7979166666666666 | 0 |
| 0.7986111111111112 | 0 |
| 0.7993055555555556 | 0 |
| 0.7999999999999999 | 0 |
| 0.8006944444444444 | 0 |
| 0.8013888888888889 | 0 |
| 0.8020833333333334 | 0 |
| 0.8027777777777777 | 0 |
| 0.8034722222222223 | 0 |
| 0.8041666666666667 | 0 |
| 0.8048611111111111 | 0 |
| 0.8055555555555555 | 0 |
| 0.80625 | 0 |
| 0.8069444444444445 | 0 |
| 0.8076388888888889 | 0 |
| 0.8083333333333332 | 0 |
| 0.8090277777777778 | 0 |
| 0.8097222222222222 | 0 |
| 0.8104166666666667 | 0 |
| 0.811111111111111 | 0 |
| 0.8118055555555556 | 0 |
| 0.8125 | 0 |
| 0.8131944444444444 | 0 |
| 0.813888888888889 | 0 |
| 0.8145833333333333 | 0 |
| 0.8152777777777778 | 0 |
| 0.8159722222222222 | 0 |
| 0.8166666666666668 | 0 |
| 0.8173611111111111 | 0 |
| 0.8180555555555555 | 0 |
| 0.81875 | 0 |
| 0.8194444444444445 | 0 |
| 0.8201388888888889 | 0 |
| 0.8208333333333333 | 0 |
| 0.8215277777777777 | 0 |
| 0.8222222222222223 | 0 |
| 0.8229166666666666 | 0 |
| 0.8236111111111111 | 0 |
| 0.8243055555555556 | 0 |
| 0.8250000000000001 | 0 |
| 0.8256944444444444 | 0 |
| 0.8263888888888888 | 0 |
| 0.8270833333333334 | 0 |
| 0.8277777777777778 | 0 |
| 0.8284722222222222 | 0 |
| 0.8291666666666666 | 0 |
| 0.8298611111111112 | 0 |
| 0.8305555555555556 | 0 |
| 0.8312499999999999 | 0 |
| 0.8319444444444444 | 0 |
| 0.8326388888888889 | 0 |
| 0.8333333333333334 | 0 |
| 0.8340277777777777 | 0 |
| 0.8347222222222223 | 0 |
| 0.8354166666666667 | 0 |
| 0.8361111111111111 | 0 |
| 0.8368055555555555 | 0 |
| 0.8375 | 0 |
| 0.8381944444444445 | 0 |
| 0.8388888888888889 | 0 |
| 0.8395833333333332 | 0 |
| 0.8402777777777778 | 0 |
| 0.8409722222222222 | 0 |
| 0.8416666666666667 | 0 |
| 0.842361111111111 | 0 |
| 0.8430555555555556 | 0 |
| 0.84375 | 0 |
| 0.8444444444444444 | 0 |
| 0.845138888888889 | 0 |
| 0.8458333333333333 | 0 |
| 0.8465277777777778 | 0 |
| 0.8472222222222222 | 0 |
| 0.8479166666666668 | 0 |
| 0.8486111111111111 | 0 |
| 0.8493055555555555 | 0 |
| 0.85 | 0 |
| 0.8506944444444445 | 0 |
| 0.8513888888888889 | 0 |
| 0.8520833333333333 | 0 |
| 0.8527777777777777 | 0 |
| 0.8534722222222223 | 0 |
| 0.8541666666666666 | 0 |
| 0.8548611111111111 | 0 |
| 0.8555555555555556 | 0 |
| 0.8562500000000001 | 0 |
| 0.8569444444444444 | 0 |
| 0.8576388888888888 | 0 |
| 0.8583333333333334 | 0 |
| 0.8590277777777778 | 0 |
| 0.8597222222222222 | 0 |
| 0.8604166666666666 | 0 |
| 0.8611111111111112 | 0 |
| 0.8618055555555556 | 0 |
| 0.8624999999999999 | 0 |
| 0.8631944444444444 | 0 |
| 0.8638888888888889 | 0 |
| 0.8645833333333334 | 0 |
| 0.8652777777777777 | 0 |
| 0.8659722222222223 | 0 |
| 0.8666666666666667 | 0 |
| 0.8673611111111111 | 0 |
| 0.8680555555555555 | 0 |
| 0.86875 | 0 |
| 0.8694444444444445 | 0 |
| 0.8701388888888889 | 0 |
| 0.8708333333333332 | 0 |
| 0.8715277777777778 | 0 |
| 0.8722222222222222 | 0 |
| 0.8729166666666667 | 0 |
| 0.873611111111111 | 0 |
| 0.8743055555555556 | 0 |
| 0.875 | 0 |
| 0.8756944444444444 | 0 |
| 0.876388888888889 | 0 |
| 0.8770833333333333 | 0 |
| 0.8777777777777778 | 0 |
| 0.8784722222222222 | 0 |
| 0.8791666666666668 | 0 |
| 0.8798611111111111 | 0 |
| 0.8805555555555555 | 0 |
| 0.88125 | 0 |
| 0.8819444444444445 | 0 |
| 0.8826388888888889 | 0 |
| 0.8833333333333333 | 0 |
| 0.8840277777777777 | 0 |
| 0.8847222222222223 | 0 |
| 0.8854166666666666 | 0 |
| 0.8861111111111111 | 0 |
| 0.8868055555555556 | 0 |
| 0.8875000000000001 | 0 |
| 0.8881944444444444 | 0 |
| 0.8888888888888888 | 0 |
| 0.8895833333333334 | 0 |
| 0.8902777777777778 | 0 |
| 0.8909722222222222 | 0 |
| 0.8916666666666666 | 0 |
| 0.8923611111111112 | 0 |
| 0.8930555555555556 | 0 |
| 0.8937499999999999 | 0 |
| 0.8944444444444444 | 0 |
| 0.8951388888888889 | 0 |
| 0.8958333333333334 | 0 |
| 0.8965277777777777 | 0 |
| 0.8972222222222223 | 0 |
| 0.8979166666666667 | 0 |
| 0.8986111111111111 | 0 |
| 0.8993055555555555 | 0 |
| 0.9 | 0 |
| 0.9006944444444445 | 0 |
| 0.9013888888888889 | 0 |
| 0.9020833333333332 | 0 |
| 0.9027777777777778 | 0 |
| 0.9034722222222222 | 0 |
| 0.9041666666666667 | 0 |
| 0.904861111111111 | 0 |
| 0.9055555555555556 | 0 |
| 0.90625 | 0 |
| 0.9069444444444444 | 0 |
| 0.907638888888889 | 0 |
| 0.9083333333333333 | 0 |
| 0.9090277777777778 | 0 |
| 0.9097222222222222 | 0 |
| 0.9104166666666668 | 0 |
| 0.9111111111111111 | 0 |
| 0.9118055555555555 | 0 |
| 0.9125 | 0 |
| 0.9131944444444445 | 0 |
| 0.9138888888888889 | 0 |
| 0.9145833333333333 | 0 |
| 0.9152777777777777 | 0 |
| 0.9159722222222223 | 0 |
| 0.9166666666666666 | 0 |
| 0.9173611111111111 | 0 |
| 0.9180555555555556 | 0 |
| 0.9187500000000001 | 0 |
| 0.9194444444444444 | 0 |
| 0.9201388888888888 | 0 |
| 0.9208333333333334 | 0 |
| 0.9215277777777778 | 0 |
| 0.9222222222222222 | 0 |
| 0.9229166666666666 | 0 |
| 0.9236111111111112 | 0 |
| 0.9243055555555556 | 0 |
| 0.9249999999999999 | 0 |
| 0.9256944444444444 | 0 |
| 0.9263888888888889 | 0 |
| 0.9270833333333334 | 0 |
| 0.9277777777777777 | 0 |
| 0.9284722222222223 | 0 |
| 0.9291666666666667 | 0 |
| 0.9298611111111111 | 0 |
| 0.9305555555555555 | 0 |
| 0.93125 | 0 |
| 0.9319444444444445 | 0 |
| 0.9326388888888889 | 0 |
| 0.9333333333333332 | 0 |
| 0.9340277777777778 | 0 |
| 0.9347222222222222 | 0 |
| 0.9354166666666667 | 0 |
| 0.936111111111111 | 0 |
| 0.9368055555555556 | 0 |
| 0.9375 | 0 |
| 0.9381944444444444 | 0 |
| 0.938888888888889 | 0 |
| 0.9395833333333333 | 0 |
| 0.9402777777777778 | 0 |
| 0.9409722222222222 | 0 |
| 0.9416666666666668 | 0 |
| 0.9423611111111111 | 0 |
| 0.9430555555555555 | 0 |
| 0.94375 | 0 |
| 0.9444444444444445 | 0 |
| 0.9451388888888889 | 0 |
| 0.9458333333333333 | 0 |
| 0.9465277777777777 | 0 |
| 0.9472222222222223 | 0 |
| 0.9479166666666666 | 0 |
| 0.9486111111111111 | 0 |
| 0.9493055555555556 | 0 |
| 0.9500000000000001 | 0 |
| 0.9506944444444444 | 0 |
| 0.9513888888888888 | 0 |
| 0.9520833333333334 | 0 |
| 0.9527777777777778 | 0 |
| 0.9534722222222222 | 0 |
| 0.9541666666666666 | 0 |
| 0.9548611111111112 | 0 |
| 0.9555555555555556 | 0 |
| 0.9562499999999999 | 0 |
| 0.9569444444444444 | 0 |
| 0.9576388888888889 | 0 |
| 0.9583333333333334 | 0 |
| 0.9590277777777777 | 0 |
| 0.9597222222222223 | 0 |
| 0.9604166666666667 | 0 |
| 0.9611111111111111 | 0 |
| 0.9618055555555555 | 0 |
| 0.9625 | 0 |
| 0.9631944444444445 | 0 |
| 0.9638888888888889 | 0 |
| 0.9645833333333332 | 0 |
| 0.9652777777777778 | 0 |
| 0.9659722222222222 | 0 |
| 0.9666666666666667 | 0 |
| 0.967361111111111 | 0 |
| 0.9680555555555556 | 0 |
| 0.96875 | 0 |
| 0.9694444444444444 | 0 |
| 0.970138888888889 | 0 |
| 0.9708333333333333 | 0 |
| 0.9715277777777778 | 0 |
| 0.9722222222222222 | 0 |
| 0.9729166666666668 | 0 |
| 0.9736111111111111 | 0 |
| 0.9743055555555555 | 0 |
| 0.975 | 0 |
| 0.9756944444444445 | 0 |
| 0.9763888888888889 | 0 |
| 0.9770833333333333 | 0 |
| 0.9777777777777777 | 0 |
| 0.9784722222222223 | 0 |
| 0.9791666666666666 | 0 |
| 0.9798611111111111 | 0 |
| 0.9805555555555556 | 0 |
| 0.9812500000000001 | 0 |
| 0.9819444444444444 | 0 |
| 0.9826388888888888 | 0 |
| 0.9833333333333334 | 0 |
| 0.9840277777777778 | 0 |
| 0.9847222222222222 | 0 |
| 0.9854166666666666 | 0 |
| 0.9861111111111112 | 0 |
| 0.9868055555555556 | 0 |
| 0.9874999999999999 | 0 |
| 0.9881944444444444 | 0 |
| 0.9888888888888889 | 0 |
| 0.9895833333333334 | 0 |
| 0.9902777777777777 | 0 |
| 0.9909722222222223 | 0 |
| 0.9916666666666667 | 0 |
| 0.9923611111111111 | 0 |
| 0.9930555555555555 | 0 |
| 0.99375 | 0 |
| 0.9944444444444445 | 0 |
| 0.9951388888888889 | 0 |
| 0.9958333333333332 | 0 |
| 0.9965277777777778 | 0 |
| 0.9972222222222222 | 0 |
| 0.9979166666666667 | 0 |
| 0.998611111111111 | 0 |
| 0.9993055555555556 | 0 |